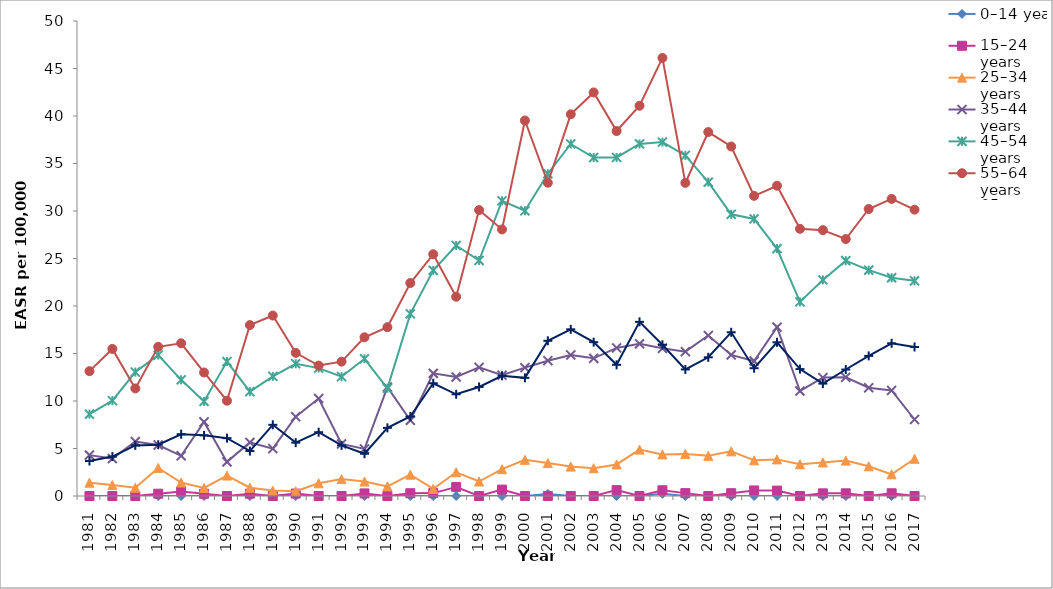
| Category | 0–14 years | 15–24 years | 25–34 years | 35–44 years | 45–54 years | 55–64 years | 65 + years |
|---|---|---|---|---|---|---|---|
| 1981.0 | 0 | 0 | 1.397 | 4.303 | 8.614 | 13.143 | 3.685 |
| 1982.0 | 0 | 0 | 1.158 | 3.937 | 10.037 | 15.481 | 4.151 |
| 1983.0 | 0 | 0 | 0.87 | 5.726 | 13.048 | 11.323 | 5.327 |
| 1984.0 | 0 | 0.242 | 2.958 | 5.368 | 14.832 | 15.704 | 5.398 |
| 1985.0 | 0 | 0.479 | 1.415 | 4.232 | 12.229 | 16.076 | 6.503 |
| 1986.0 | 0 | 0.241 | 0.85 | 7.799 | 9.955 | 13.001 | 6.385 |
| 1987.0 | 0 | 0 | 2.152 | 3.591 | 14.149 | 10.034 | 6.09 |
| 1988.0 | 0 | 0.246 | 0.874 | 5.637 | 10.982 | 17.993 | 4.731 |
| 1989.0 | 0 | 0 | 0.567 | 4.987 | 12.594 | 18.994 | 7.494 |
| 1990.0 | 0 | 0.255 | 0.507 | 8.344 | 13.92 | 15.066 | 5.616 |
| 1991.0 | 0 | 0 | 1.338 | 10.259 | 13.464 | 13.73 | 6.715 |
| 1992.0 | 0 | 0 | 1.777 | 5.479 | 12.563 | 14.142 | 5.33 |
| 1993.0 | 0 | 0.272 | 1.521 | 4.952 | 14.444 | 16.71 | 4.449 |
| 1994.0 | 0 | 0 | 1.012 | 11.461 | 11.338 | 17.771 | 7.174 |
| 1995.0 | 0 | 0.292 | 2.246 | 7.968 | 19.175 | 22.418 | 8.372 |
| 1996.0 | 0 | 0.305 | 0.75 | 12.911 | 23.754 | 25.449 | 11.865 |
| 1997.0 | 0 | 0.951 | 2.496 | 12.531 | 26.37 | 20.976 | 10.707 |
| 1998.0 | 0 | 0 | 1.524 | 13.541 | 24.79 | 30.096 | 11.478 |
| 1999.0 | 0 | 0.674 | 2.822 | 12.715 | 31.073 | 28.059 | 12.658 |
| 2000.0 | 0 | 0 | 3.804 | 13.515 | 30.025 | 39.524 | 12.437 |
| 2001.0 | 0.219 | 0 | 3.463 | 14.245 | 33.925 | 32.974 | 16.336 |
| 2002.0 | 0 | 0 | 3.096 | 14.85 | 37.059 | 40.178 | 17.546 |
| 2003.0 | 0 | 0 | 2.923 | 14.492 | 35.625 | 42.481 | 16.194 |
| 2004.0 | 0 | 0.616 | 3.32 | 15.586 | 35.639 | 38.416 | 13.811 |
| 2005.0 | 0 | 0 | 4.882 | 16.017 | 37.061 | 41.077 | 18.331 |
| 2006.0 | 0.226 | 0.604 | 4.378 | 15.544 | 37.25 | 46.112 | 15.922 |
| 2007.0 | 0 | 0.303 | 4.431 | 15.193 | 35.848 | 32.96 | 13.323 |
| 2008.0 | 0 | 0 | 4.228 | 16.895 | 33.046 | 38.311 | 14.601 |
| 2009.0 | 0 | 0.297 | 4.7 | 14.848 | 29.652 | 36.79 | 17.233 |
| 2010.0 | 0 | 0.586 | 3.754 | 14.208 | 29.164 | 31.595 | 13.451 |
| 2011.0 | 0 | 0.569 | 3.854 | 17.773 | 26.045 | 32.662 | 16.179 |
| 2012.0 | 0 | 0 | 3.338 | 11.047 | 20.435 | 28.125 | 13.36 |
| 2013.0 | 0 | 0.281 | 3.533 | 12.466 | 22.746 | 27.985 | 11.829 |
| 2014.0 | 0 | 0.282 | 3.725 | 12.494 | 24.77 | 27.05 | 13.313 |
| 2015.0 | 0 | 0 | 3.125 | 11.393 | 23.774 | 30.214 | 14.747 |
| 2016.0 | 0 | 0.286 | 2.282 | 11.109 | 22.972 | 31.271 | 16.076 |
| 2017.0 | 0 | 0 | 3.918 | 8.053 | 22.646 | 30.141 | 15.686 |